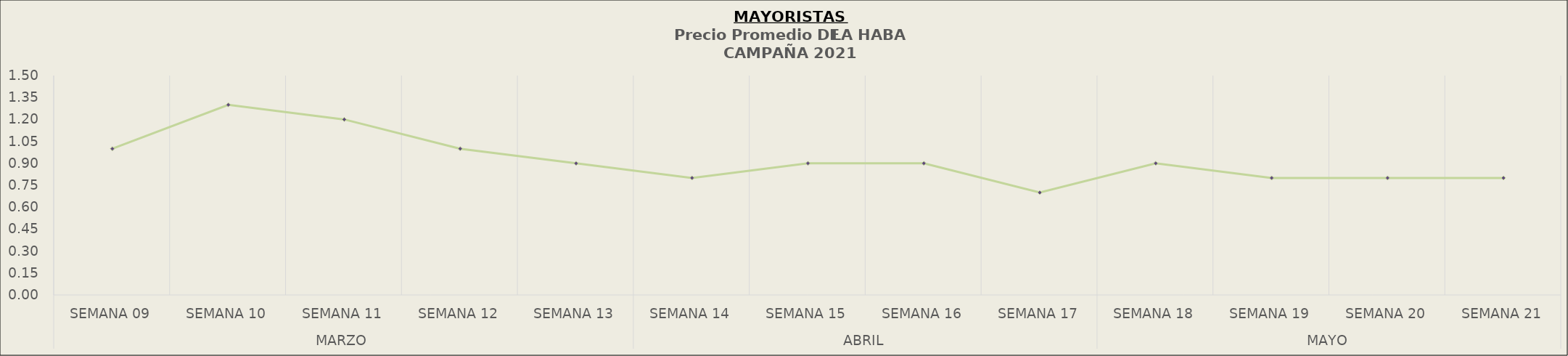
| Category | Precio Promedio ( S/.x Kg.) |
|---|---|
| 0 | 1 |
| 1 | 1.3 |
| 2 | 1.2 |
| 3 | 1 |
| 4 | 0.9 |
| 5 | 0.8 |
| 6 | 0.9 |
| 7 | 0.9 |
| 8 | 0.7 |
| 9 | 0.9 |
| 10 | 0.8 |
| 11 | 0.8 |
| 12 | 0.8 |